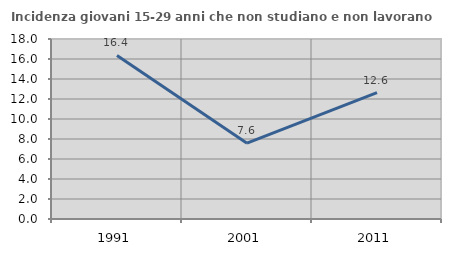
| Category | Incidenza giovani 15-29 anni che non studiano e non lavorano  |
|---|---|
| 1991.0 | 16.352 |
| 2001.0 | 7.586 |
| 2011.0 | 12.629 |